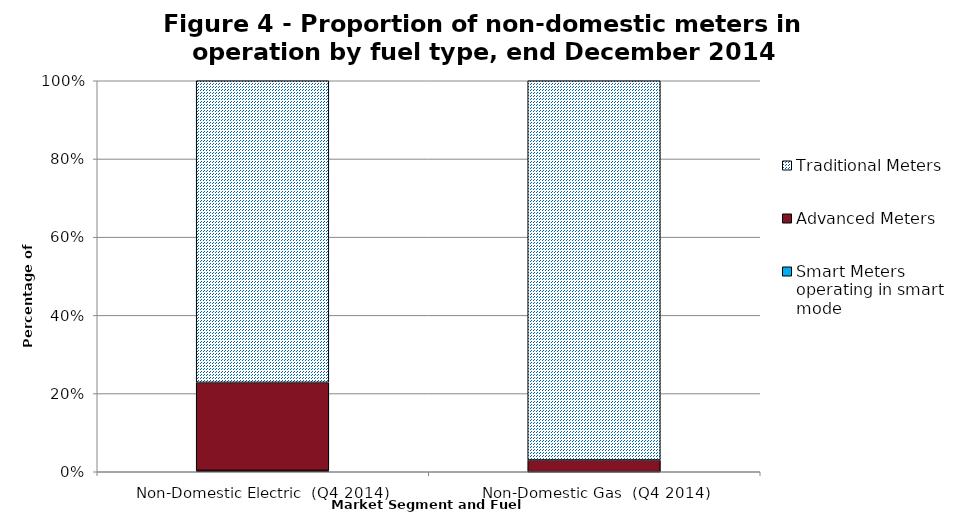
| Category | Smart Meters operating in smart mode | Advanced Meters | Traditional Meters |
|---|---|---|---|
| Non-Domestic Electric  (Q4 2014) | 7743 | 498719 | 1709367 |
| Non-Domestic Gas  (Q4 2014) | 27 | 15089 | 487946 |